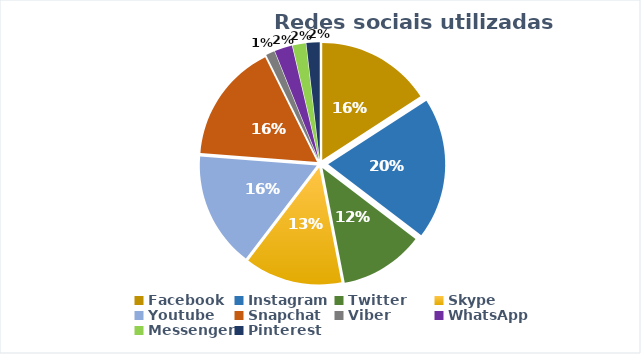
| Category | Series 0 |
|---|---|
| Facebook | 26 |
| Instagram | 32 |
| Twitter | 19 |
| Skype | 22 |
| Youtube | 26 |
| Snapchat | 27 |
| Viber | 2 |
| WhatsApp | 4 |
| Messenger | 3 |
| Pinterest  | 3 |